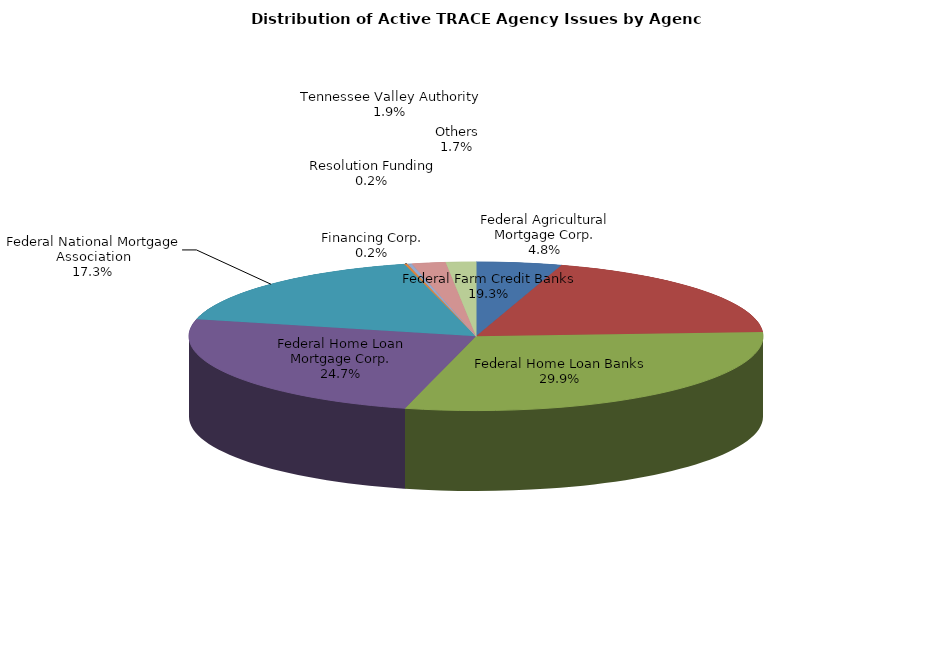
| Category | Series 0 |
|---|---|
| Federal Agricultural Mortgage Corp. | 1196 |
| Federal Farm Credit Banks | 4798 |
| Federal Home Loan Banks | 7438 |
| Federal Home Loan Mortgage Corp. | 6153 |
| Federal National Mortgage Association | 4305 |
| Financing Corp. | 45 |
| Resolution Funding | 59 |
| Tennessee Valley Authority | 474 |
| Others | 419 |